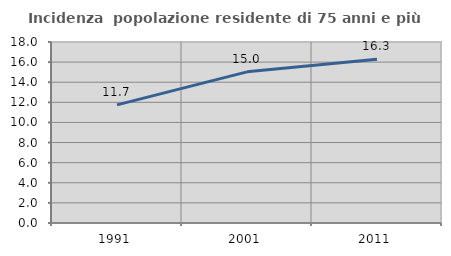
| Category | Incidenza  popolazione residente di 75 anni e più |
|---|---|
| 1991.0 | 11.747 |
| 2001.0 | 15.032 |
| 2011.0 | 16.286 |